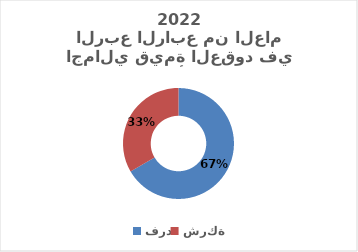
| Category | Series 0 |
|---|---|
| فرد | 0.666 |
| شركة | 0.334 |